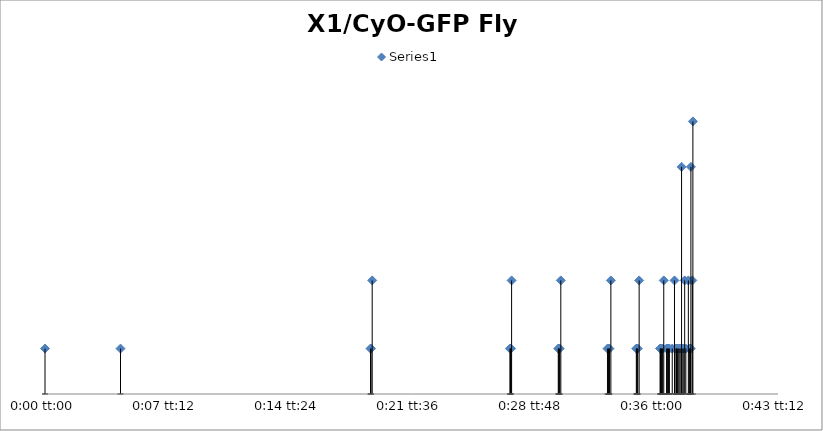
| Category | Series 0 |
|---|---|
| 0.0 | 2 |
| 0.003090277777777782 | 2 |
| 0.013321759259259266 | 2 |
| 0.013344907407407406 | 2 |
| 0.013391203703703707 | 5 |
| 0.019027777777777786 | 2 |
| 0.019050925925925926 | 2 |
| 0.01907407407407408 | 2 |
| 0.019097222222222227 | 5 |
| 0.021006944444444443 | 2 |
| 0.021030092592592597 | 2 |
| 0.02104166666666667 | 2 |
| 0.021064814814814817 | 2 |
| 0.02111111111111112 | 5 |
| 0.023020833333333334 | 2 |
| 0.023067129629629635 | 2 |
| 0.023078703703703702 | 2 |
| 0.023101851851851856 | 2 |
| 0.023159722222222224 | 5 |
| 0.024201388888888887 | 2 |
| 0.02422453703703704 | 2 |
| 0.024236111111111115 | 2 |
| 0.02425925925925926 | 2 |
| 0.02431712962962963 | 5 |
| 0.025173611111111115 | 2 |
| 0.02519675925925927 | 2 |
| 0.025208333333333336 | 2 |
| 0.02521990740740741 | 2 |
| 0.025243055555555564 | 2 |
| 0.025277777777777777 | 2 |
| 0.025324074074074086 | 5 |
| 0.02543981481481482 | 2 |
| 0.02546296296296297 | 2 |
| 0.025486111111111116 | 2 |
| 0.025520833333333336 | 2 |
| 0.025555555555555564 | 2 |
| 0.025671296296296307 | 2 |
| 0.025763888888888895 | 5 |
| 0.025821759259259263 | 2 |
| 0.025844907407407417 | 2 |
| 0.025856481481481484 | 2 |
| 0.02589120370370371 | 2 |
| 0.025937500000000006 | 2 |
| 0.0259837962962963 | 2 |
| 0.0260300925925926 | 2 |
| 0.02605324074074074 | 10 |
| 0.026076388888888895 | 2 |
| 0.02612268518518519 | 2 |
| 0.026180555555555558 | 5 |
| 0.026226851851851852 | 2 |
| 0.02633101851851852 | 5 |
| 0.02636574074074075 | 2 |
| 0.026388888888888896 | 2 |
| 0.026412037037037043 | 2 |
| 0.026423611111111116 | 2 |
| 0.02643518518518519 | 10 |
| 0.026493055555555565 | 5 |
| 0.026516203703703705 | 12 |